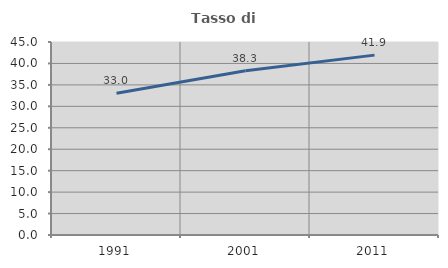
| Category | Tasso di occupazione   |
|---|---|
| 1991.0 | 33.038 |
| 2001.0 | 38.296 |
| 2011.0 | 41.938 |